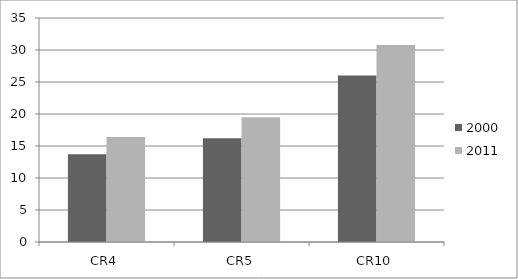
| Category | 2000 | 2011 |
|---|---|---|
| CR4 | 13.7 | 16.4 |
| CR5 | 16.2 | 19.5 |
| CR10 | 26 | 30.8 |